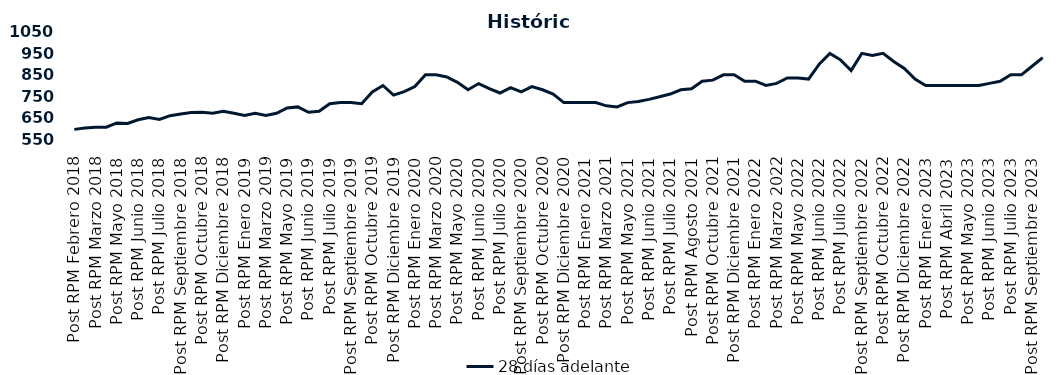
| Category | 28 días adelante |
|---|---|
| Post RPM Febrero 2018 | 595 |
| Pre RPM Marzo 2018 | 601 |
| Post RPM Marzo 2018 | 605 |
| Pre RPM Mayo 2018 | 605 |
| Post RPM Mayo 2018 | 625 |
| Pre RPM Junio 2018 | 623 |
| Post RPM Junio 2018 | 640 |
| Pre RPM Julio 2018 | 650 |
| Post RPM Julio 2018 | 641 |
| Pre RPM Septiembre 2018 | 659 |
| Post RPM Septiembre 2018 | 666.75 |
| Pre RPM Octubre 2018 | 674 |
| Post RPM Octubre 2018 | 675 |
| Pre RPM Diciembre 2018 | 670 |
| Post RPM Diciembre 2018 | 680 |
| Pre RPM Enero 2019 | 670 |
| Post RPM Enero 2019 | 660 |
| Pre RPM Marzo 2019 | 670 |
| Post RPM Marzo 2019 | 660 |
| Pre RPM Mayo 2019 | 670 |
| Post RPM Mayo 2019 | 695 |
| Pre RPM Junio 2019 | 700 |
| Post RPM Junio 2019 | 675 |
| Pre RPM Julio 2019 | 680 |
| Post RPM Julio 2019 | 715 |
| Pre RPM Septiembre 2019 | 720 |
| Post RPM Septiembre 2019 | 720 |
| Pre RPM Octubre 2019 | 715 |
| Post RPM Octubre 2019 | 770 |
| Pre RPM Diciembre 2019 | 800 |
| Post RPM Diciembre 2019 | 755 |
| Pre RPM Enero 2020 | 771 |
| Post RPM Enero 2020 | 795 |
| Pre RPM Marzo 2020 | 850 |
| Post RPM Marzo 2020 | 850 |
| Pre RPM Mayo 2020 | 840 |
| Post RPM Mayo 2020 | 815 |
| Pre RPM Junio 2020 | 780 |
| Post RPM Junio 2020 | 809 |
| Pre RPM Julio 2020 | 785.72 |
| Post RPM Julio 2020 | 765 |
| Pre RPM Septiembre 2020 | 790 |
| Post RPM Septiembre 2020 | 770 |
| Pre RPM Octubre 2020 | 795 |
| Post RPM Octubre 2020 | 780 |
| Pre RPM Diciembre 2020 | 760 |
| Post RPM Diciembre 2020 | 720 |
| Pre RPM Enero 2021 | 720 |
| Post RPM Enero 2021 | 720 |
| Pre RPM Marzo 2021 | 720 |
| Post RPM Marzo 2021 | 705 |
| Pre RPM Mayo 2021 | 700 |
| Post RPM Mayo 2021 | 720 |
| Pre RPM Junio 2021 | 725 |
| Post RPM Junio 2021 | 735 |
| Pre RPM Julio 2021 | 747.5 |
| Post RPM Julio 2021 | 760 |
| Pre RPM Agosto 2021 | 780 |
| Post RPM Agosto 2021 | 785 |
| Pre RPM Octubre 2021 | 820 |
| Post RPM Octubre 2021 | 825 |
| Pre RPM Diciembre 2021 | 850 |
| Post RPM Diciembre 2021 | 850 |
| Pre RPM Enero 2022 | 820 |
| Post RPM Enero 2022 | 820 |
| Pre RPM Marzo 2022 | 800 |
| Post RPM Marzo 2022 | 810 |
| Pre RPM Mayo 2022 | 835 |
| Post RPM Mayo 2022 | 835 |
| Pre RPM Junio 2022 | 830 |
| Post RPM Junio 2022 | 900 |
| Pre RPM Julio 2022 | 950 |
| Post RPM Julio 2022 | 920 |
| Pre RPM Septiembre 2022 | 870 |
| Post RPM Septiembre 2022 | 950 |
| Pre RPM Octubre 2022 | 940 |
| Post RPM Octubre 2022 | 950 |
| Pre RPM Diciembre 2022 | 912.5 |
| Post RPM Diciembre 2022 | 880 |
| Pre RPM Enero 2023 | 830 |
| Post RPM Enero 2023 | 800 |
| Pre RPM Abril 2023 | 800 |
| Post RPM Abril 2023 | 800 |
| Pre RPM Mayo 2023 | 800 |
| Post RPM Mayo 2023 | 800 |
| Pre RPM Junio 2023 | 800 |
| Post RPM Junio 2023 | 810 |
| Pre RPM Julio 2023 | 820 |
| Post RPM Julio 2023 | 850 |
| Pre RPM Septiembre 2023 | 850 |
| Post RPM Septiembre 2023 | 890 |
| Pre RPM Octubre 2023 | 930 |